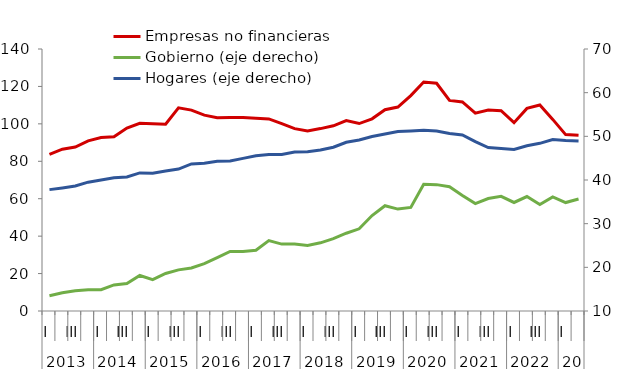
| Category | Empresas no financieras  |
|---|---|
| 0 | 83.644 |
| 1 | 86.468 |
| 2 | 87.607 |
| 3 | 90.915 |
| 4 | 92.704 |
| 5 | 93.052 |
| 6 | 97.793 |
| 7 | 100.32 |
| 8 | 100.023 |
| 9 | 99.818 |
| 10 | 108.548 |
| 11 | 107.351 |
| 12 | 104.651 |
| 13 | 103.322 |
| 14 | 103.421 |
| 15 | 103.406 |
| 16 | 103.046 |
| 17 | 102.644 |
| 18 | 100.088 |
| 19 | 97.45 |
| 20 | 96.132 |
| 21 | 97.469 |
| 22 | 98.966 |
| 23 | 101.726 |
| 24 | 100.17 |
| 25 | 102.679 |
| 26 | 107.526 |
| 27 | 108.972 |
| 28 | 115.112 |
| 29 | 122.328 |
| 30 | 121.676 |
| 31 | 112.526 |
| 32 | 111.69 |
| 33 | 105.729 |
| 34 | 107.434 |
| 35 | 107.046 |
| 36 | 100.627 |
| 37 | 108.275 |
| 38 | 110.048 |
| 39 | 102.397 |
| 40 | 94.261 |
| 41 | 93.891 |